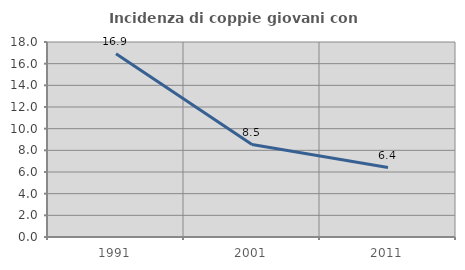
| Category | Incidenza di coppie giovani con figli |
|---|---|
| 1991.0 | 16.918 |
| 2001.0 | 8.532 |
| 2011.0 | 6.41 |